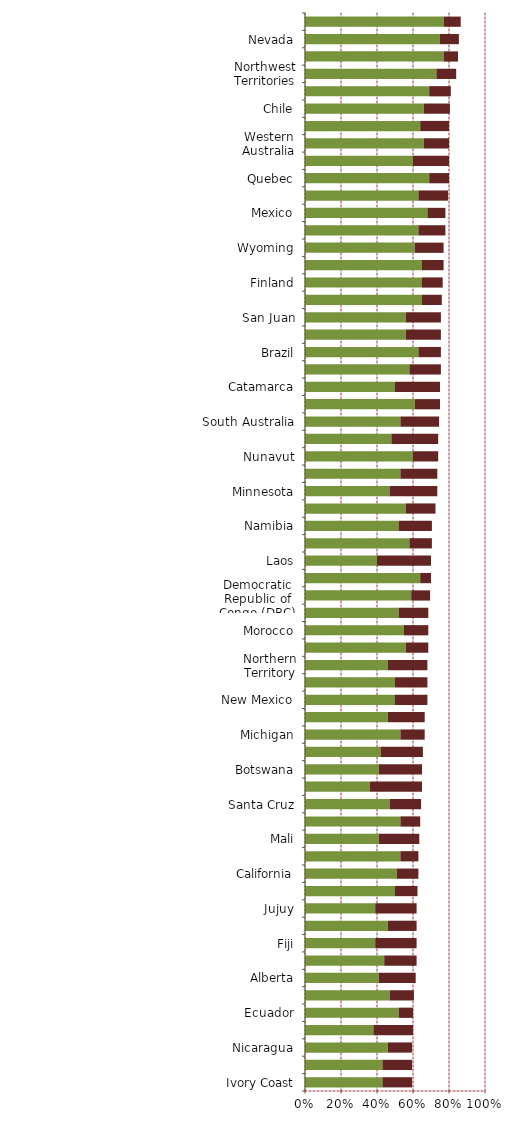
| Category |   Encourages Investment |   Not a Deterrent to Investment |
|---|---|---|
| Ivory Coast | 0.43 | 0.165 |
| Tanzania | 0.43 | 0.165 |
| Nicaragua | 0.46 | 0.135 |
| Chubut | 0.38 | 0.22 |
| Ecuador | 0.52 | 0.08 |
| Greenland | 0.47 | 0.135 |
| Alberta | 0.41 | 0.205 |
| Tasmania | 0.44 | 0.18 |
| Fiji | 0.39 | 0.23 |
| Ghana | 0.46 | 0.16 |
| Jujuy | 0.39 | 0.23 |
| Mongolia | 0.5 | 0.125 |
| California | 0.51 | 0.12 |
| Guyana | 0.53 | 0.1 |
| Mali | 0.41 | 0.225 |
| Colombia | 0.53 | 0.11 |
| Santa Cruz | 0.47 | 0.175 |
| New Brunswick | 0.36 | 0.29 |
| Botswana | 0.41 | 0.24 |
| Colorado | 0.42 | 0.235 |
| Michigan | 0.53 | 0.135 |
| Ireland | 0.46 | 0.205 |
| New Mexico | 0.5 | 0.18 |
| Russia | 0.5 | 0.18 |
| Northern Territory | 0.46 | 0.22 |
| Indonesia | 0.56 | 0.125 |
| Morocco | 0.55 | 0.135 |
| Sweden | 0.52 | 0.165 |
| Democratic Republic of Congo (DRC) | 0.59 | 0.105 |
| Papua New Guinea | 0.64 | 0.06 |
| Laos | 0.4 | 0.3 |
| Myanmar | 0.58 | 0.125 |
| Namibia | 0.52 | 0.185 |
| Montana | 0.56 | 0.165 |
| Minnesota | 0.47 | 0.265 |
| Salta | 0.53 | 0.205 |
| Nunavut | 0.6 | 0.14 |
| Utah | 0.48 | 0.26 |
| South Australia | 0.53 | 0.215 |
| Queensland | 0.61 | 0.14 |
| Catamarca | 0.5 | 0.25 |
| Newfoundland & Labrador | 0.58 | 0.175 |
| Brazil | 0.63 | 0.125 |
| Zambia | 0.56 | 0.195 |
| San Juan | 0.56 | 0.195 |
| Ontario | 0.65 | 0.11 |
| Finland | 0.65 | 0.115 |
| British Columbia | 0.65 | 0.12 |
| Wyoming | 0.61 | 0.16 |
| Arizona | 0.63 | 0.15 |
| Mexico | 0.68 | 0.1 |
| Saskatchewan | 0.63 | 0.165 |
| Quebec | 0.69 | 0.11 |
| Idaho | 0.6 | 0.2 |
| Western Australia | 0.66 | 0.14 |
| Peru | 0.64 | 0.16 |
| Chile | 0.66 | 0.145 |
| Manitoba | 0.69 | 0.12 |
| Northwest Territories | 0.73 | 0.11 |
| Alaska | 0.77 | 0.08 |
| Nevada | 0.75 | 0.105 |
| Yukon | 0.77 | 0.095 |